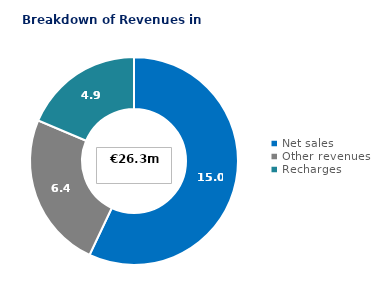
| Category | Series 0 |
|---|---|
| Net sales | 15 |
| Other revenues | 6.4 |
| Recharges | 4.9 |